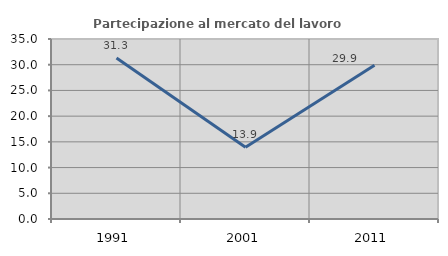
| Category | Partecipazione al mercato del lavoro  femminile |
|---|---|
| 1991.0 | 31.316 |
| 2001.0 | 13.934 |
| 2011.0 | 29.891 |